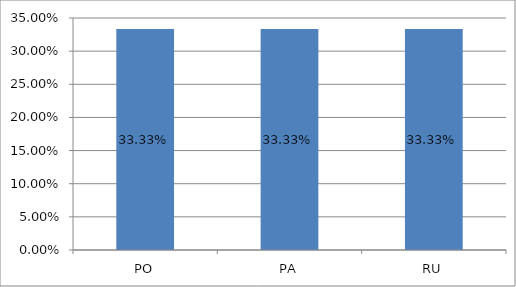
| Category | Series 0 |
|---|---|
| PO | 0.333 |
| PA | 0.333 |
| RU | 0.333 |